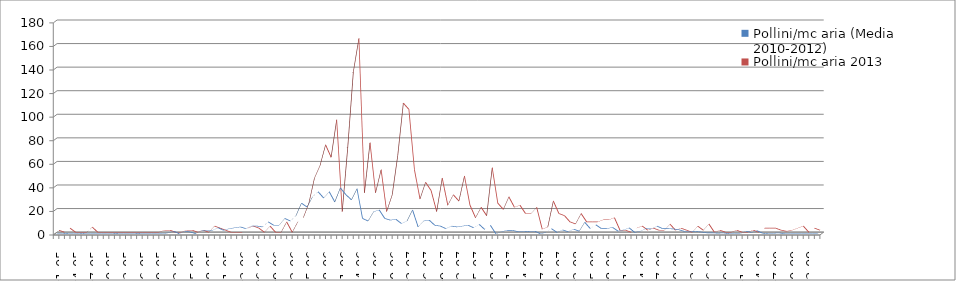
| Category | Pollini/mc aria (Media 2010-2012) | Pollini/mc aria 2013 |
|---|---|---|
| 01-05 | 0 | 1.77 |
| 02-05 | 0.433 | 0 |
| 03-05 | 0 | 3.54 |
| 04-05 | 0 | 0 |
| 05-05 | 0.433 | 0 |
| 06-05 | 0 | 0 |
| 07-05 | 0 | 4.42 |
| 08-05 | 0 | 0 |
| 09-05 | 0 | 0 |
| 10-05 | 0 | 0 |
| 11-05 | 0.433 | 0 |
| 12-05 | 0 | 0 |
| 13-05 | 0 | 0 |
| 14-05 | 0 | 0 |
| 15-05 | 0.433 | 0 |
| 16-05 | 0 | 0 |
| 17-05 | 0 | 0 |
| 18-05 | 0 | 0 |
| 19-05 | 0 | 0 |
| 20-05 | 0 | 1.77 |
| 21-05 | 0.72 | 1.77 |
| 22-05 | 2.16 | 0 |
| 23-05 | 0 | 0 |
| 24-05 | 2.16 | 1.77 |
| 25-05 | 1.44 | 1.77 |
| 26-05 | 0 | 0 |
| 27-05 | 2.88 | 1.77 |
| 28-05 | 2.88 | 0 |
| 29-05 | 2.88 | 5.3 |
| 30-05 | 5.04 | 3.54 |
| 31-05 | 2.88 | 1.77 |
| 01-06 | 4.32 | 0 |
| 02-06 | 5.04 | 0 |
| 03-06 | 5.76 | 0 |
| 04-06 | 4.32 | 3.54 |
| 05-06 | 6.48 | 5.3 |
| 06-06 | 6.48 | 3.54 |
| 07-06 | 5.76 | 0 |
| 08-06 | 10.083 | 5.3 |
| 09-06 | 7.2 | 0 |
| 10-06 | 7.2 | 0 |
| 11-06 | 12.963 | 8.84 |
| 12-06 | 10.803 | 0 |
| 13-06 | 15.123 | 8.84 |
| 14-06 | 25.925 | 12.37 |
| 15-06 | 22.685 | 24.75 |
| 16-06 | 31.325 | 45.96 |
| 17-06 | 35.65 | 56.57 |
| 18-06 | 30.245 | 74.24 |
| 19-06 | 35.65 | 63.64 |
| 20-06 | 27.005 | 95.45 |
| 21-06 | 38.89 | 17.68 |
| 22-06 | 33.127 | 72.47 |
| 23-06 | 28.807 | 136.11 |
| 24-06 | 38.167 | 164.39 |
| 25-06 | 12.96 | 33.59 |
| 26-06 | 10.8 | 76.01 |
| 27-06 | 18.723 | 33.59 |
| 28-06 | 20.163 | 53.03 |
| 29-06 | 12.96 | 17.68 |
| 30-06 | 11.523 | 31.82 |
| 01-07 | 12.243 | 65.4 |
| 02-07 | 8.64 | 109.6 |
| 03-07 | 10.8 | 104.29 |
| 04-07 | 20.163 | 53.03 |
| 05-07 | 5.76 | 28.28 |
| 06-07 | 10.8 | 42.42 |
| 07-07 | 11.523 | 35.35 |
| 08-07 | 7.2 | 17.68 |
| 09-07 | 6.48 | 45.96 |
| 10-07 | 4.32 | 22.98 |
| 11-07 | 6.48 | 31.82 |
| 12-07 | 5.76 | 26.52 |
| 13-07 | 6.48 | 47.73 |
| 14-07 | 7.2 | 22.98 |
| 15-07 | 5.04 | 12.37 |
| 16-07 | 7.92 | 21.21 |
| 17-07 | 3.6 | 14.14 |
| 18-07 | 7.2 | 54.8 |
| 19-07 | 0 | 24.75 |
| 20-07 | 1.73 | 19.44 |
| 21-07 | 2.81 | 30.05 |
| 22-07 | 2.81 | 21.21 |
| 23-07 | 1.73 | 22.98 |
| 24-07 | 2.16 | 15.91 |
| 25-07 | 1.73 | 15.91 |
| 26-07 | 2.16 | 21.21 |
| 27-07 | 0 | 2.65 |
| 28-07 | 1.08 | 4.42 |
| 29-07 | 4.32 | 26.52 |
| 30-07 | 1.08 | 15.91 |
| 31-07 | 3.24 | 14.14 |
| 01-08 | 1.73 | 8.84 |
| 02-08 | 3.89 | 7.07 |
| 03-08 | 2.16 | 15.91 |
| 04-08 | 9.72 | 8.84 |
| 05-08 | 4.32 | 8.84 |
| 06-08 | 7.56 | 8.84 |
| 07-08 | 4.32 | 10.61 |
| 08-08 | 4.32 | 10.61 |
| 09-08 | 5.4 | 12.37 |
| 10-08 | 2.16 | 1.77 |
| 11-08 | 3.24 | 1.77 |
| 12-08 | 4.97 | 0 |
| 13-08 | 1.08 | 3.54 |
| 14-08 | 2.16 | 5.3 |
| 15-08 | 4.32 | 1.77 |
| 16-08 | 4.033 | 3.54 |
| 17-08 | 6.48 | 1.77 |
| 18-08 | 4.32 | 1.77 |
| 19-08 | 4.32 | 6.91 |
| 20-08 | 4.033 | 1.73 |
| 21-08 | 3.313 | 3.46 |
| 22-08 | 1.873 | 1.73 |
| 23-08 | 2.16 | 0 |
| 24-08 | 1.873 | 5.19 |
| 25-08 | 1.44 | 1.73 |
| 26-08 | 0.72 | 7.07 |
| 27-08 | 0.72 | 0 |
| 28-08 | 0.43 | 1.77 |
| 29-08 | 0.65 | 0 |
| 30-08 | 0 | 0 |
| 31-08 | 0 | 1.77 |
| 01-09 | 0 | 0 |
| 02-09 | 2.16 | 0 |
| 03-09 | 1.08 | 1.77 |
| 04-09 | 2.595 | 0 |
| 05-09 | 0.43 | 3.54 |
| 06-09 | 0 | 3.54 |
| 07-09 | 0.43 | 3.54 |
| 08-09 | 0.65 | 1.77 |
| 09-09 | 0 | 0.88 |
| 10-09 | 0 | 1.77 |
| 11-09 | 0 | 3.54 |
| 12-09 | 0 | 5.3 |
| 13-09 | 0 | 0 |
| 14-09 | 0 | 3.54 |
| 15-09 | 0 | 1.77 |